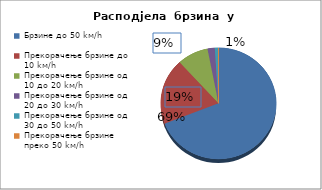
| Category | Series 0 |
|---|---|
| Брзине до 50 kм/h | 0.692 |
| Прекорачење брзине до 10 kм/h | 0.192 |
| Прекорачење брзине од 10 до 20 kм/h | 0.087 |
| Прекорачење брзине од 20 до 30 kм/h | 0.02 |
| Прекорачење брзине од 30 до 50 kм/h | 0.01 |
| Прекорачење брзине преко 50 kм/h | 0 |